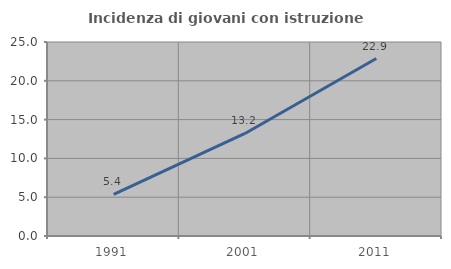
| Category | Incidenza di giovani con istruzione universitaria |
|---|---|
| 1991.0 | 5.352 |
| 2001.0 | 13.217 |
| 2011.0 | 22.868 |